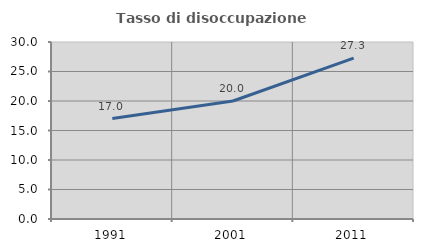
| Category | Tasso di disoccupazione giovanile  |
|---|---|
| 1991.0 | 17.021 |
| 2001.0 | 20 |
| 2011.0 | 27.273 |